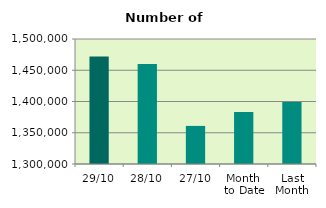
| Category | Series 0 |
|---|---|
| 29/10 | 1471802 |
| 28/10 | 1459906 |
| 27/10 | 1360946 |
| Month 
to Date | 1383348.571 |
| Last
Month | 1399299.909 |